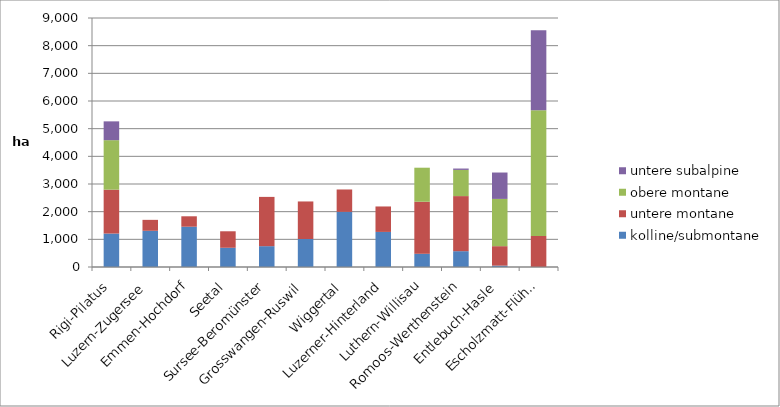
| Category | kolline/submontane | untere montane | obere montane | untere subalpine |
|---|---|---|---|---|
| Rigi-Pilatus | 1209 | 1587 | 1788 | 680 |
| Luzern-Zugersee | 1309 | 395 | 0 | 0 |
| Emmen-Hochdorf | 1456 | 377 | 0 | 0 |
| Seetal | 695 | 596 | 0 | 0 |
| Sursee-Beromünster | 753 | 1781 | 0 | 0 |
| Grosswangen-Ruswil | 1012 | 1357 | 0 | 0 |
| Wiggertal | 1994 | 808 | 0 | 0 |
| Luzerner-Hinterland | 1268 | 920 | 0 | 0 |
| Luthern-Willisau | 477 | 1882 | 1230 | 0 |
| Romoos-Werthenstein | 572 | 1991 | 946 | 50 |
| Entlebuch-Hasle | 50 | 703 | 1708 | 954 |
| Escholzmatt-Flühli | 0 | 1123 | 4540 | 2894 |